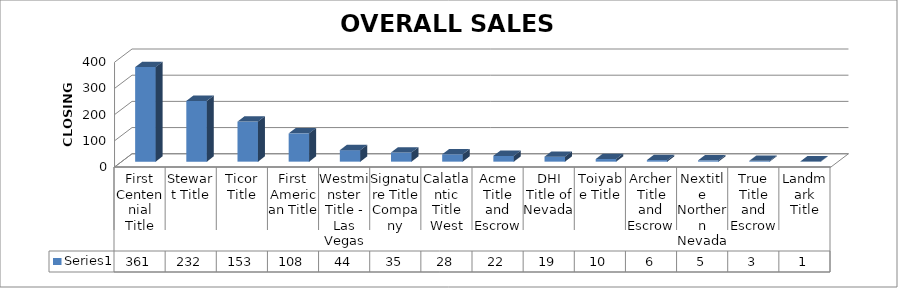
| Category | Series 0 |
|---|---|
| First Centennial Title | 361 |
| Stewart Title | 232 |
| Ticor Title | 153 |
| First American Title | 108 |
| Westminster Title - Las Vegas | 44 |
| Signature Title Company | 35 |
| Calatlantic Title West | 28 |
| Acme Title and Escrow | 22 |
| DHI Title of Nevada | 19 |
| Toiyabe Title | 10 |
| Archer Title and Escrow | 6 |
| Nextitle Northern Nevada | 5 |
| True Title and Escrow | 3 |
| Landmark Title | 1 |